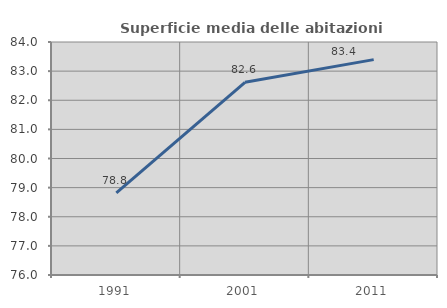
| Category | Superficie media delle abitazioni occupate |
|---|---|
| 1991.0 | 78.819 |
| 2001.0 | 82.617 |
| 2011.0 | 83.396 |